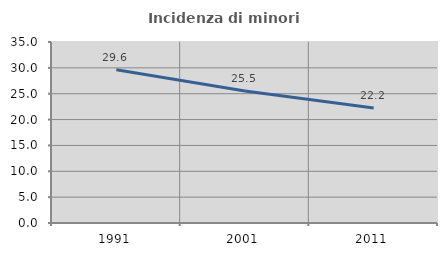
| Category | Incidenza di minori stranieri |
|---|---|
| 1991.0 | 29.63 |
| 2001.0 | 25.532 |
| 2011.0 | 22.222 |